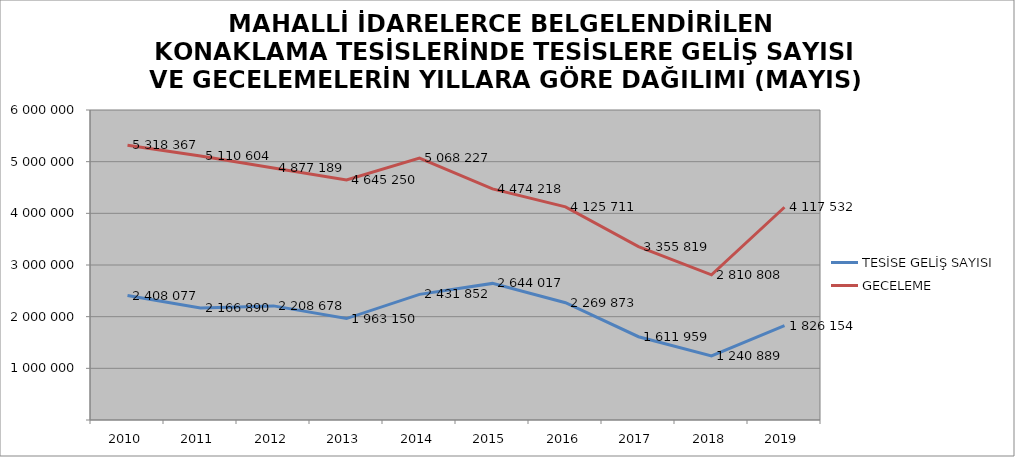
| Category | TESİSE GELİŞ SAYISI | GECELEME |
|---|---|---|
| 2010 | 2408077 | 5318367 |
| 2011 | 2166890 | 5110604 |
| 2012 | 2208678 | 4877189 |
| 2013 | 1963150 | 4645250 |
| 2014 | 2431852 | 5068227 |
| 2015 | 2644017 | 4474218 |
| 2016 | 2269873 | 4125711 |
| 2017 | 1611959 | 3355819 |
| 2018 | 1240889 | 2810808 |
| 2019 | 1826154 | 4117532 |